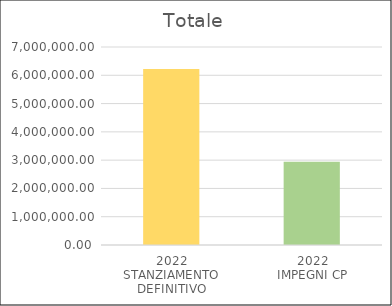
| Category | Series 0 |
|---|---|
| 2022
STANZIAMENTO DEFINITIVO | 6221877.06 |
| 2022
IMPEGNI CP | 2941656.03 |